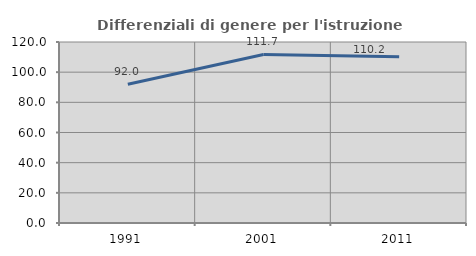
| Category | Differenziali di genere per l'istruzione superiore |
|---|---|
| 1991.0 | 92.013 |
| 2001.0 | 111.717 |
| 2011.0 | 110.177 |